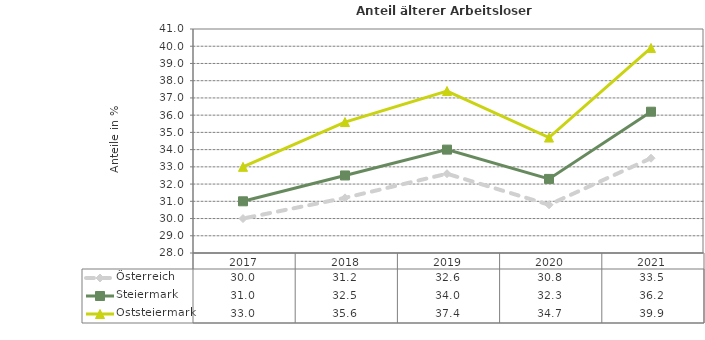
| Category | Österreich | Steiermark | Oststeiermark |
|---|---|---|---|
| 2021.0 | 33.5 | 36.2 | 39.9 |
| 2020.0 | 30.8 | 32.3 | 34.7 |
| 2019.0 | 32.6 | 34 | 37.4 |
| 2018.0 | 31.2 | 32.5 | 35.6 |
| 2017.0 | 30 | 31 | 33 |